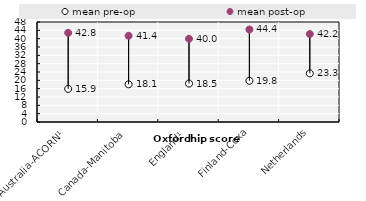
| Category | mean pre-op | mean post-op |
|---|---|---|
| Australia-ACORN¹ | 15.9 | 42.8 |
| Canada-Manitoba | 18.09 | 41.39 |
| England¹ | 18.462 | 39.956 |
| Finland-Coxa | 19.79 | 44.41 |
| Netherlands | 23.336 | 42.22 |